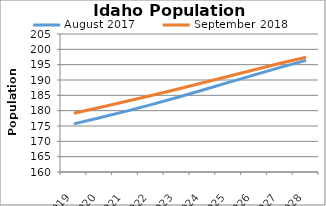
| Category | August 2017 | September 2018 |
|---|---|---|
| 2019.0 | 175.699 | 179.18 |
| 2020.0 | 177.672 | 181.057 |
| 2021.0 | 179.766 | 182.963 |
| 2022.0 | 181.976 | 184.938 |
| 2023.0 | 184.303 | 186.99 |
| 2024.0 | 186.726 | 189.098 |
| 2025.0 | 189.207 | 191.225 |
| 2026.0 | 191.689 | 193.358 |
| 2027.0 | 194.114 | 195.459 |
| 2028.0 | 196.41 | 197.419 |